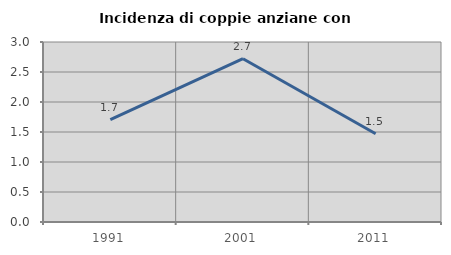
| Category | Incidenza di coppie anziane con figli |
|---|---|
| 1991.0 | 1.705 |
| 2001.0 | 2.721 |
| 2011.0 | 1.471 |